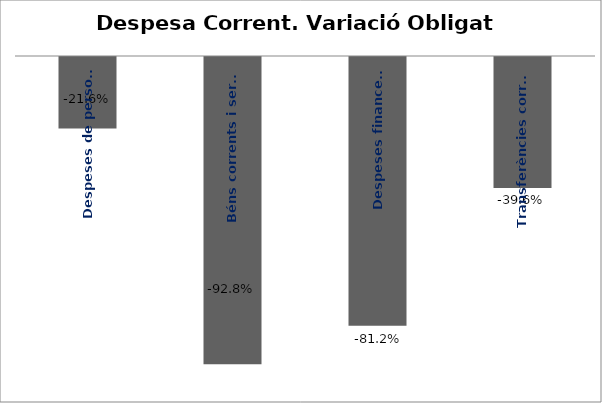
| Category | Series 0 |
|---|---|
| Despeses de personal | -0.216 |
| Béns corrents i serveis | -0.928 |
| Despeses financeres | -0.812 |
| Transferències corrents | -0.396 |